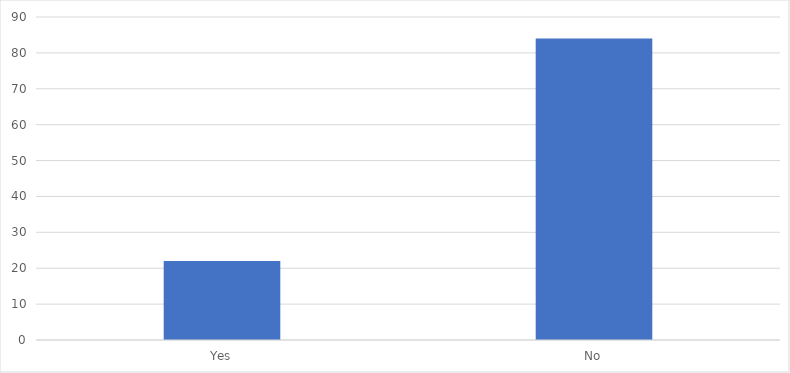
| Category | Number of Responses |
|---|---|
| Yes | 22 |
| No | 84 |